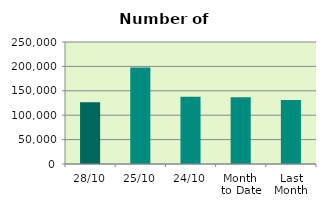
| Category | Series 0 |
|---|---|
| 28/10 | 126494 |
| 25/10 | 197644 |
| 24/10 | 137552 |
| Month 
to Date | 137021 |
| Last
Month | 130923.048 |